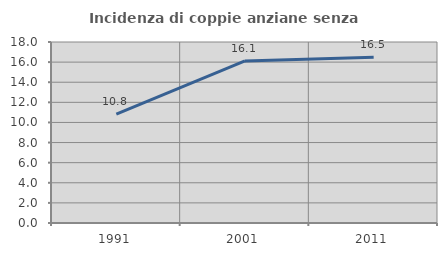
| Category | Incidenza di coppie anziane senza figli  |
|---|---|
| 1991.0 | 10.823 |
| 2001.0 | 16.122 |
| 2011.0 | 16.484 |